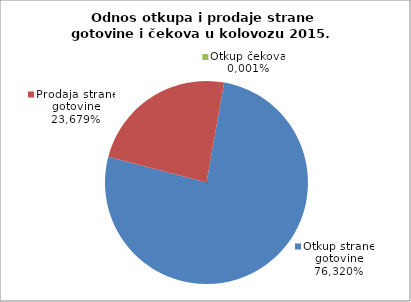
| Category | Otkup strane gotovine |
|---|---|
| 0 | 0.763 |
| 1 | 0.237 |
| 2 | 0 |